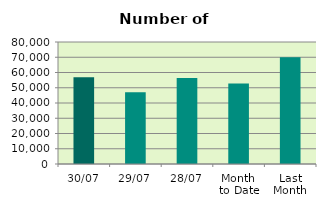
| Category | Series 0 |
|---|---|
| 30/07 | 56936 |
| 29/07 | 46988 |
| 28/07 | 56430 |
| Month 
to Date | 52793.636 |
| Last
Month | 70062.455 |